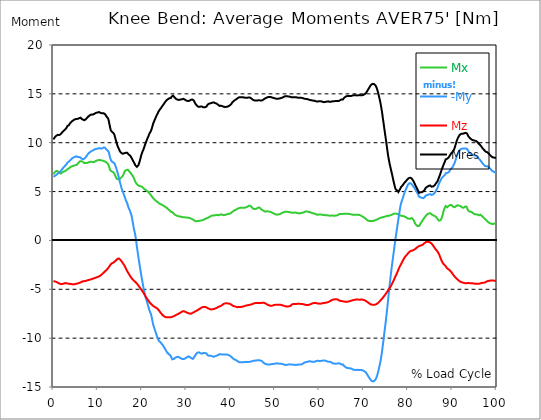
| Category |  Mx |  -My |  Mz |  Mres |
|---|---|---|---|---|
| 0.0 | 6.769 | 6.522 | -4.175 | 10.341 |
| 0.167348456675344 | 6.879 | 6.559 | -4.184 | 10.451 |
| 0.334696913350688 | 6.988 | 6.605 | -4.193 | 10.56 |
| 0.5020453700260321 | 7.061 | 6.65 | -4.211 | 10.642 |
| 0.669393826701376 | 7.107 | 6.705 | -4.248 | 10.716 |
| 0.83674228337672 | 7.107 | 6.769 | -4.294 | 10.77 |
| 1.0040907400520642 | 7.08 | 6.842 | -4.33 | 10.807 |
| 1.1621420602454444 | 7.016 | 6.897 | -4.367 | 10.807 |
| 1.3294905169207885 | 6.934 | 6.934 | -4.403 | 10.789 |
| 1.4968389735961325 | 6.851 | 7.007 | -4.44 | 10.798 |
| 1.6641874302714765 | 6.851 | 7.116 | -4.467 | 10.88 |
| 1.8315358869468206 | 6.915 | 7.198 | -4.476 | 10.971 |
| 1.9988843436221646 | 6.961 | 7.299 | -4.467 | 11.072 |
| 2.1662328002975086 | 7.007 | 7.39 | -4.449 | 11.145 |
| 2.333581256972853 | 7.043 | 7.491 | -4.412 | 11.227 |
| 2.5009297136481967 | 7.08 | 7.582 | -4.403 | 11.3 |
| 2.6682781703235405 | 7.098 | 7.646 | -4.367 | 11.355 |
| 2.8356266269988843 | 7.116 | 7.701 | -4.357 | 11.401 |
| 3.002975083674229 | 7.217 | 7.829 | -4.385 | 11.547 |
| 3.1703235403495724 | 7.317 | 7.966 | -4.403 | 11.711 |
| 3.337671997024917 | 7.336 | 8.03 | -4.421 | 11.775 |
| 3.4957233172182973 | 7.336 | 8.057 | -4.431 | 11.793 |
| 3.663071773893641 | 7.436 | 8.139 | -4.44 | 11.921 |
| 3.8304202305689854 | 7.509 | 8.222 | -4.458 | 12.031 |
| 3.997768687244329 | 7.555 | 8.295 | -4.458 | 12.104 |
| 4.165117143919673 | 7.582 | 8.377 | -4.476 | 12.186 |
| 4.332465600595017 | 7.61 | 8.432 | -4.485 | 12.25 |
| 4.499814057270361 | 7.628 | 8.477 | -4.494 | 12.296 |
| 4.667162513945706 | 7.664 | 8.514 | -4.494 | 12.342 |
| 4.834510970621049 | 7.71 | 8.541 | -4.476 | 12.387 |
| 5.001859427296393 | 7.71 | 8.587 | -4.449 | 12.405 |
| 5.169207883971737 | 7.728 | 8.614 | -4.44 | 12.433 |
| 5.336556340647081 | 7.756 | 8.569 | -4.421 | 12.415 |
| 5.503904797322425 | 7.847 | 8.541 | -4.403 | 12.442 |
| 5.671253253997769 | 7.938 | 8.523 | -4.376 | 12.479 |
| 5.82930457419115 | 8.012 | 8.523 | -4.357 | 12.515 |
| 5.996653030866494 | 8.103 | 8.514 | -4.33 | 12.57 |
| 6.164001487541838 | 8.149 | 8.477 | -4.294 | 12.561 |
| 6.331349944217181 | 8.112 | 8.368 | -4.239 | 12.451 |
| 6.498698400892526 | 8.085 | 8.313 | -4.202 | 12.378 |
| 6.66604685756787 | 8.039 | 8.322 | -4.184 | 12.36 |
| 6.833395314243213 | 7.957 | 8.331 | -4.166 | 12.305 |
| 7.000743770918558 | 7.911 | 8.368 | -4.166 | 12.305 |
| 7.168092227593902 | 7.902 | 8.432 | -4.156 | 12.342 |
| 7.335440684269246 | 7.92 | 8.523 | -4.138 | 12.405 |
| 7.50278914094459 | 7.911 | 8.633 | -4.12 | 12.469 |
| 7.6701375976199335 | 7.938 | 8.761 | -4.083 | 12.579 |
| 7.837486054295278 | 7.966 | 8.852 | -4.056 | 12.643 |
| 7.995537374488658 | 8.002 | 8.943 | -4.047 | 12.725 |
| 8.162885831164003 | 8.039 | 9.016 | -4.029 | 12.807 |
| 8.330234287839346 | 8.048 | 9.062 | -4.001 | 12.844 |
| 8.49758274451469 | 8.039 | 9.108 | -3.983 | 12.862 |
| 8.664931201190035 | 8.039 | 9.163 | -3.956 | 12.89 |
| 8.832279657865378 | 8.021 | 9.199 | -3.928 | 12.908 |
| 8.999628114540721 | 8.002 | 9.226 | -3.901 | 12.899 |
| 9.166976571216066 | 8.021 | 9.263 | -3.882 | 12.935 |
| 9.334325027891412 | 8.057 | 9.318 | -3.846 | 12.981 |
| 9.501673484566755 | 8.103 | 9.354 | -3.809 | 13.027 |
| 9.669021941242098 | 8.158 | 9.382 | -3.791 | 13.072 |
| 9.836370397917442 | 8.185 | 9.4 | -3.764 | 13.1 |
| 10.003718854592787 | 8.194 | 9.391 | -3.736 | 13.091 |
| 10.17106731126813 | 8.222 | 9.418 | -3.709 | 13.109 |
| 10.329118631461512 | 8.24 | 9.455 | -3.672 | 13.136 |
| 10.496467088136853 | 8.231 | 9.464 | -3.618 | 13.118 |
| 10.663815544812199 | 8.203 | 9.409 | -3.581 | 13.045 |
| 10.831164001487544 | 8.194 | 9.391 | -3.535 | 13.018 |
| 10.998512458162887 | 8.185 | 9.418 | -3.453 | 13.008 |
| 11.16586091483823 | 8.176 | 9.446 | -3.398 | 12.999 |
| 11.333209371513574 | 8.13 | 9.51 | -3.307 | 13.008 |
| 11.50055782818892 | 8.085 | 9.546 | -3.206 | 12.981 |
| 11.667906284864264 | 8.075 | 9.482 | -3.161 | 12.926 |
| 11.835254741539607 | 8.012 | 9.373 | -3.088 | 12.798 |
| 12.00260319821495 | 7.966 | 9.272 | -3.015 | 12.67 |
| 12.169951654890292 | 7.911 | 9.236 | -2.942 | 12.606 |
| 12.337300111565641 | 7.82 | 9.19 | -2.85 | 12.497 |
| 12.504648568240984 | 7.637 | 9.035 | -2.741 | 12.25 |
| 12.662699888434362 | 7.399 | 8.733 | -2.631 | 11.857 |
| 12.830048345109708 | 7.18 | 8.432 | -2.521 | 11.474 |
| 12.997396801785053 | 7.089 | 8.203 | -2.421 | 11.227 |
| 13.164745258460396 | 7.071 | 8.085 | -2.348 | 11.127 |
| 13.33209371513574 | 7.034 | 8.048 | -2.311 | 11.072 |
| 13.499442171811083 | 6.988 | 7.993 | -2.284 | 10.999 |
| 13.666790628486426 | 6.906 | 7.984 | -2.229 | 10.926 |
| 13.834139085161771 | 6.76 | 7.838 | -2.165 | 10.706 |
| 14.001487541837117 | 6.586 | 7.628 | -2.101 | 10.423 |
| 14.16883599851246 | 6.413 | 7.427 | -2.028 | 10.158 |
| 14.336184455187803 | 6.294 | 7.18 | -1.955 | 9.893 |
| 14.503532911863147 | 6.23 | 6.906 | -1.873 | 9.647 |
| 14.670881368538492 | 6.248 | 6.641 | -1.845 | 9.473 |
| 14.828932688731873 | 6.294 | 6.34 | -1.854 | 9.318 |
| 14.996281145407215 | 6.294 | 6.011 | -1.928 | 9.135 |
| 15.163629602082558 | 6.358 | 5.709 | -2.01 | 9.035 |
| 15.330978058757903 | 6.44 | 5.417 | -2.101 | 8.952 |
| 15.498326515433247 | 6.513 | 5.18 | -2.211 | 8.888 |
| 15.665674972108594 | 6.596 | 5.015 | -2.32 | 8.87 |
| 15.833023428783937 | 6.769 | 4.796 | -2.43 | 8.907 |
| 16.00037188545928 | 6.97 | 4.568 | -2.549 | 8.925 |
| 16.167720342134626 | 7.107 | 4.367 | -2.704 | 8.962 |
| 16.335068798809967 | 7.189 | 4.129 | -2.85 | 8.962 |
| 16.502417255485312 | 7.217 | 4.047 | -3.015 | 9.007 |
| 16.669765712160658 | 7.235 | 3.8 | -3.152 | 8.962 |
| 16.837114168836 | 7.226 | 3.535 | -3.28 | 8.888 |
| 17.004462625511344 | 7.144 | 3.298 | -3.398 | 8.797 |
| 17.16251394570472 | 7.034 | 3.161 | -3.535 | 8.733 |
| 17.32986240238007 | 6.97 | 2.96 | -3.654 | 8.669 |
| 17.497210859055414 | 6.86 | 2.741 | -3.764 | 8.55 |
| 17.664559315730756 | 6.751 | 2.485 | -3.873 | 8.432 |
| 17.8319077724061 | 6.641 | 2.055 | -3.956 | 8.276 |
| 17.999256229081443 | 6.522 | 1.635 | -4.038 | 8.13 |
| 18.166604685756788 | 6.385 | 1.188 | -4.111 | 7.993 |
| 18.333953142432133 | 6.184 | 0.868 | -4.184 | 7.838 |
| 18.501301599107478 | 5.993 | 0.502 | -4.257 | 7.683 |
| 18.668650055782823 | 5.865 | -0.009 | -4.33 | 7.591 |
| 18.835998512458165 | 5.773 | -0.603 | -4.412 | 7.536 |
| 19.00334696913351 | 5.691 | -1.133 | -4.504 | 7.573 |
| 19.170695425808855 | 5.618 | -1.653 | -4.604 | 7.683 |
| 19.338043882484197 | 5.582 | -2.147 | -4.705 | 7.893 |
| 19.496095202677576 | 5.572 | -2.64 | -4.814 | 8.149 |
| 19.66344365935292 | 5.554 | -3.115 | -4.924 | 8.423 |
| 19.830792116028263 | 5.527 | -3.572 | -5.024 | 8.733 |
| 19.998140572703612 | 5.49 | -4.01 | -5.143 | 8.952 |
| 20.165489029378953 | 5.417 | -4.431 | -5.253 | 9.144 |
| 20.3328374860543 | 5.335 | -4.86 | -5.362 | 9.327 |
| 20.500185942729644 | 5.262 | -5.198 | -5.49 | 9.537 |
| 20.667534399404985 | 5.207 | -5.6 | -5.618 | 9.775 |
| 20.83488285608033 | 5.152 | -5.874 | -5.755 | 9.994 |
| 21.002231312755672 | 5.116 | -6.093 | -5.874 | 10.186 |
| 21.16957976943102 | 5.061 | -6.349 | -5.984 | 10.378 |
| 21.336928226106362 | 4.988 | -6.605 | -6.093 | 10.551 |
| 21.504276682781704 | 4.906 | -6.879 | -6.203 | 10.734 |
| 21.67162513945705 | 4.823 | -7.153 | -6.303 | 10.926 |
| 21.82967645965043 | 4.732 | -7.345 | -6.404 | 11.063 |
| 21.997024916325774 | 4.641 | -7.518 | -6.495 | 11.191 |
| 22.16437337300112 | 4.531 | -7.829 | -6.559 | 11.392 |
| 22.33172182967646 | 4.449 | -8.203 | -6.623 | 11.656 |
| 22.499070286351806 | 4.339 | -8.578 | -6.696 | 11.93 |
| 22.666418743027148 | 4.248 | -8.834 | -6.751 | 12.131 |
| 22.833767199702496 | 4.175 | -9.062 | -6.797 | 12.305 |
| 23.00111565637784 | 4.102 | -9.281 | -6.851 | 12.479 |
| 23.168464113053183 | 4.038 | -9.528 | -6.888 | 12.661 |
| 23.335812569728528 | 3.974 | -9.756 | -6.934 | 12.835 |
| 23.50316102640387 | 3.928 | -9.948 | -6.998 | 12.972 |
| 23.670509483079215 | 3.864 | -10.158 | -7.071 | 13.136 |
| 23.83785793975456 | 3.8 | -10.295 | -7.171 | 13.273 |
| 23.995909259947936 | 3.755 | -10.387 | -7.272 | 13.383 |
| 24.163257716623285 | 3.709 | -10.423 | -7.381 | 13.456 |
| 24.330606173298627 | 3.7 | -10.533 | -7.473 | 13.584 |
| 24.49795462997397 | 3.654 | -10.615 | -7.564 | 13.694 |
| 24.665303086649313 | 3.599 | -10.697 | -7.646 | 13.794 |
| 24.83265154332466 | 3.554 | -10.816 | -7.719 | 13.913 |
| 25.0 | 3.499 | -10.953 | -7.774 | 14.022 |
| 25.167348456675345 | 3.453 | -11.081 | -7.82 | 14.132 |
| 25.334696913350694 | 3.407 | -11.2 | -7.847 | 14.233 |
| 25.502045370026035 | 3.362 | -11.337 | -7.865 | 14.333 |
| 25.669393826701377 | 3.289 | -11.474 | -7.874 | 14.424 |
| 25.836742283376722 | 3.225 | -11.538 | -7.865 | 14.452 |
| 26.004090740052067 | 3.161 | -11.62 | -7.865 | 14.507 |
| 26.17143919672741 | 3.097 | -11.702 | -7.874 | 14.552 |
| 26.329490516920792 | 3.015 | -11.739 | -7.865 | 14.552 |
| 26.49683897359613 | 2.942 | -11.803 | -7.856 | 14.571 |
| 26.66418743027148 | 2.914 | -12.013 | -7.838 | 14.717 |
| 26.831535886946828 | 2.878 | -12.168 | -7.811 | 14.817 |
| 26.998884343622166 | 2.814 | -12.205 | -7.792 | 14.817 |
| 27.166232800297514 | 2.75 | -12.131 | -7.756 | 14.726 |
| 27.333581256972852 | 2.677 | -12.095 | -7.701 | 14.653 |
| 27.5009297136482 | 2.613 | -12.004 | -7.674 | 14.552 |
| 27.668278170323543 | 2.558 | -11.949 | -7.637 | 14.479 |
| 27.835626626998888 | 2.54 | -11.93 | -7.591 | 14.433 |
| 28.002975083674233 | 2.503 | -11.921 | -7.564 | 14.406 |
| 28.170323540349575 | 2.485 | -11.903 | -7.527 | 14.37 |
| 28.33767199702492 | 2.466 | -11.94 | -7.491 | 14.379 |
| 28.50502045370026 | 2.448 | -12.004 | -7.427 | 14.406 |
| 28.663071773893645 | 2.439 | -12.04 | -7.39 | 14.415 |
| 28.830420230568986 | 2.421 | -12.077 | -7.345 | 14.415 |
| 28.99776868724433 | 2.393 | -12.131 | -7.29 | 14.443 |
| 29.165117143919673 | 2.375 | -12.15 | -7.253 | 14.443 |
| 29.33246560059502 | 2.384 | -12.214 | -7.253 | 14.497 |
| 29.499814057270367 | 2.366 | -12.122 | -7.253 | 14.406 |
| 29.66716251394571 | 2.366 | -12.113 | -7.281 | 14.406 |
| 29.834510970621054 | 2.357 | -12.058 | -7.317 | 14.37 |
| 30.00185942729639 | 2.348 | -11.985 | -7.363 | 14.315 |
| 30.169207883971744 | 2.339 | -11.93 | -7.39 | 14.287 |
| 30.33655634064708 | 2.32 | -11.903 | -7.418 | 14.269 |
| 30.50390479732243 | 2.32 | -11.867 | -7.454 | 14.26 |
| 30.671253253997772 | 2.32 | -11.876 | -7.491 | 14.287 |
| 30.829304574191156 | 2.284 | -11.949 | -7.5 | 14.342 |
| 30.996653030866494 | 2.247 | -12.013 | -7.491 | 14.388 |
| 31.164001487541842 | 2.211 | -12.068 | -7.473 | 14.424 |
| 31.331349944217187 | 2.183 | -12.095 | -7.436 | 14.424 |
| 31.498698400892525 | 2.138 | -12.122 | -7.39 | 14.415 |
| 31.666046857567874 | 2.074 | -12.058 | -7.345 | 14.324 |
| 31.833395314243212 | 2.028 | -11.885 | -7.308 | 14.159 |
| 32.00074377091856 | 1.982 | -11.775 | -7.262 | 14.041 |
| 32.1680922275939 | 1.964 | -11.638 | -7.226 | 13.913 |
| 32.33544068426925 | 1.973 | -11.547 | -7.18 | 13.812 |
| 32.50278914094459 | 1.982 | -11.483 | -7.144 | 13.739 |
| 32.670137597619934 | 1.991 | -11.455 | -7.089 | 13.694 |
| 32.83748605429528 | 2.001 | -11.455 | -7.043 | 13.666 |
| 33.004834510970625 | 2.01 | -11.474 | -7.007 | 13.666 |
| 33.162885831164004 | 2.028 | -11.538 | -6.952 | 13.694 |
| 33.33023428783935 | 2.046 | -11.592 | -6.888 | 13.73 |
| 33.497582744514695 | 2.055 | -11.592 | -6.851 | 13.712 |
| 33.664931201190036 | 2.074 | -11.556 | -6.824 | 13.666 |
| 33.83227965786538 | 2.101 | -11.51 | -6.806 | 13.62 |
| 33.99962811454073 | 2.138 | -11.519 | -6.797 | 13.62 |
| 34.16697657121607 | 2.183 | -11.529 | -6.806 | 13.63 |
| 34.33432502789141 | 2.22 | -11.547 | -6.824 | 13.657 |
| 34.50167348456676 | 2.266 | -11.556 | -6.842 | 13.684 |
| 34.6690219412421 | 2.302 | -11.62 | -6.888 | 13.776 |
| 34.83637039791744 | 2.311 | -11.757 | -6.943 | 13.913 |
| 35.00371885459279 | 2.357 | -11.784 | -6.97 | 13.968 |
| 35.17106731126814 | 2.393 | -11.812 | -6.998 | 14.004 |
| 35.338415767943474 | 2.43 | -11.812 | -7.034 | 14.032 |
| 35.49646708813686 | 2.485 | -11.803 | -7.061 | 14.041 |
| 35.6638155448122 | 2.521 | -11.803 | -7.061 | 14.05 |
| 35.831164001487544 | 2.549 | -11.848 | -7.052 | 14.086 |
| 35.998512458162885 | 2.558 | -11.894 | -7.034 | 14.114 |
| 36.165860914838234 | 2.558 | -11.912 | -7.016 | 14.132 |
| 36.333209371513576 | 2.576 | -11.885 | -6.998 | 14.095 |
| 36.50055782818892 | 2.576 | -11.848 | -6.97 | 14.059 |
| 36.667906284864266 | 2.613 | -11.803 | -6.943 | 14.022 |
| 36.83525474153961 | 2.613 | -11.793 | -6.906 | 13.995 |
| 37.002603198214956 | 2.594 | -11.803 | -6.86 | 13.968 |
| 37.1699516548903 | 2.576 | -11.739 | -6.815 | 13.885 |
| 37.337300111565646 | 2.594 | -11.666 | -6.787 | 13.821 |
| 37.50464856824098 | 2.604 | -11.629 | -6.751 | 13.767 |
| 37.66269988843437 | 2.64 | -11.638 | -6.723 | 13.767 |
| 37.83004834510971 | 2.677 | -11.656 | -6.696 | 13.785 |
| 37.99739680178505 | 2.658 | -11.684 | -6.65 | 13.776 |
| 38.16474525846039 | 2.613 | -11.675 | -6.577 | 13.73 |
| 38.33209371513574 | 2.594 | -11.675 | -6.513 | 13.694 |
| 38.49944217181109 | 2.585 | -11.675 | -6.477 | 13.675 |
| 38.666790628486424 | 2.604 | -11.666 | -6.459 | 13.657 |
| 38.83413908516178 | 2.622 | -11.666 | -6.44 | 13.657 |
| 39.001487541837115 | 2.64 | -11.666 | -6.44 | 13.666 |
| 39.16883599851246 | 2.677 | -11.684 | -6.44 | 13.684 |
| 39.336184455187805 | 2.695 | -11.702 | -6.44 | 13.703 |
| 39.503532911863154 | 2.722 | -11.72 | -6.449 | 13.73 |
| 39.670881368538495 | 2.741 | -11.775 | -6.468 | 13.785 |
| 39.83822982521384 | 2.741 | -11.812 | -6.495 | 13.831 |
| 39.996281145407224 | 2.795 | -11.83 | -6.532 | 13.876 |
| 40.163629602082565 | 2.85 | -11.903 | -6.577 | 13.977 |
| 40.33097805875791 | 2.914 | -12.013 | -6.641 | 14.114 |
| 40.498326515433256 | 2.969 | -12.086 | -6.687 | 14.205 |
| 40.6656749721086 | 3.015 | -12.122 | -6.723 | 14.26 |
| 40.83302342878393 | 3.069 | -12.177 | -6.742 | 14.333 |
| 41.00037188545929 | 3.115 | -12.205 | -6.76 | 14.37 |
| 41.16772034213463 | 3.133 | -12.241 | -6.778 | 14.415 |
| 41.33506879880997 | 3.17 | -12.278 | -6.815 | 14.47 |
| 41.50241725548531 | 3.234 | -12.314 | -6.833 | 14.516 |
| 41.66976571216066 | 3.261 | -12.396 | -6.824 | 14.598 |
| 41.837114168836 | 3.298 | -12.442 | -6.815 | 14.634 |
| 42.004462625511344 | 3.325 | -12.46 | -6.806 | 14.653 |
| 42.17181108218669 | 3.334 | -12.469 | -6.806 | 14.662 |
| 42.32986240238007 | 3.334 | -12.469 | -6.797 | 14.662 |
| 42.497210859055414 | 3.334 | -12.469 | -6.797 | 14.662 |
| 42.66455931573076 | 3.343 | -12.469 | -6.778 | 14.662 |
| 42.831907772406105 | 3.353 | -12.479 | -6.76 | 14.653 |
| 42.999256229081446 | 3.362 | -12.451 | -6.742 | 14.625 |
| 43.16660468575679 | 3.353 | -12.451 | -6.714 | 14.625 |
| 43.33395314243214 | 3.371 | -12.451 | -6.678 | 14.607 |
| 43.50130159910748 | 3.389 | -12.433 | -6.66 | 14.589 |
| 43.66865005578282 | 3.407 | -12.433 | -6.641 | 14.598 |
| 43.83599851245817 | 3.471 | -12.433 | -6.632 | 14.607 |
| 44.00334696913351 | 3.535 | -12.433 | -6.614 | 14.625 |
| 44.17069542580886 | 3.554 | -12.424 | -6.605 | 14.625 |
| 44.3380438824842 | 3.554 | -12.424 | -6.596 | 14.616 |
| 44.49609520267758 | 3.526 | -12.424 | -6.568 | 14.598 |
| 44.66344365935292 | 3.435 | -12.387 | -6.55 | 14.534 |
| 44.83079211602827 | 3.353 | -12.36 | -6.522 | 14.461 |
| 44.99814057270361 | 3.27 | -12.332 | -6.495 | 14.397 |
| 45.16548902937895 | 3.225 | -12.314 | -6.459 | 14.36 |
| 45.332837486054295 | 3.225 | -12.305 | -6.431 | 14.333 |
| 45.500185942729644 | 3.225 | -12.296 | -6.413 | 14.315 |
| 45.66753439940499 | 3.225 | -12.296 | -6.404 | 14.315 |
| 45.83488285608033 | 3.243 | -12.287 | -6.395 | 14.306 |
| 46.00223131275568 | 3.307 | -12.268 | -6.404 | 14.315 |
| 46.16957976943102 | 3.353 | -12.268 | -6.395 | 14.333 |
| 46.336928226106366 | 3.389 | -12.268 | -6.404 | 14.351 |
| 46.50427668278171 | 3.371 | -12.278 | -6.404 | 14.351 |
| 46.671625139457056 | 3.298 | -12.278 | -6.404 | 14.324 |
| 46.829676459650436 | 3.206 | -12.278 | -6.395 | 14.287 |
| 46.99702491632577 | 3.142 | -12.342 | -6.376 | 14.315 |
| 47.16437337300112 | 3.106 | -12.405 | -6.376 | 14.351 |
| 47.33172182967646 | 3.06 | -12.479 | -6.367 | 14.397 |
| 47.49907028635181 | 3.015 | -12.543 | -6.376 | 14.443 |
| 47.66641874302716 | 2.987 | -12.606 | -6.404 | 14.507 |
| 47.83376719970249 | 2.951 | -12.634 | -6.449 | 14.534 |
| 48.001115656377834 | 2.969 | -12.661 | -6.495 | 14.58 |
| 48.16846411305319 | 2.987 | -12.68 | -6.541 | 14.625 |
| 48.33581256972853 | 2.987 | -12.707 | -6.577 | 14.662 |
| 48.50316102640387 | 2.969 | -12.716 | -6.614 | 14.68 |
| 48.67050948307921 | 2.969 | -12.707 | -6.66 | 14.689 |
| 48.837857939754564 | 2.942 | -12.689 | -6.669 | 14.68 |
| 49.005206396429905 | 2.923 | -12.68 | -6.687 | 14.68 |
| 49.163257716623285 | 2.887 | -12.67 | -6.687 | 14.662 |
| 49.33060617329863 | 2.841 | -12.652 | -6.678 | 14.625 |
| 49.49795462997397 | 2.804 | -12.643 | -6.66 | 14.607 |
| 49.66530308664932 | 2.759 | -12.634 | -6.632 | 14.58 |
| 49.832651543324666 | 2.731 | -12.643 | -6.605 | 14.571 |
| 50.0 | 2.686 | -12.625 | -6.596 | 14.543 |
| 50.16734845667534 | 2.658 | -12.597 | -6.586 | 14.507 |
| 50.33469691335069 | 2.64 | -12.579 | -6.577 | 14.488 |
| 50.50204537002604 | 2.64 | -12.579 | -6.577 | 14.479 |
| 50.66939382670139 | 2.64 | -12.588 | -6.577 | 14.497 |
| 50.836742283376715 | 2.658 | -12.588 | -6.577 | 14.507 |
| 51.00409074005207 | 2.686 | -12.625 | -6.577 | 14.534 |
| 51.17143919672741 | 2.713 | -12.625 | -6.577 | 14.552 |
| 51.32949051692079 | 2.759 | -12.625 | -6.596 | 14.561 |
| 51.496838973596134 | 2.795 | -12.634 | -6.614 | 14.589 |
| 51.66418743027148 | 2.841 | -12.643 | -6.641 | 14.616 |
| 51.831535886946824 | 2.868 | -12.67 | -6.669 | 14.653 |
| 51.99888434362217 | 2.896 | -12.707 | -6.687 | 14.698 |
| 52.16623280029752 | 2.923 | -12.743 | -6.705 | 14.744 |
| 52.33358125697285 | 2.932 | -12.743 | -6.733 | 14.762 |
| 52.5009297136482 | 2.942 | -12.734 | -6.751 | 14.762 |
| 52.668278170323546 | 2.932 | -12.725 | -6.769 | 14.762 |
| 52.835626626998895 | 2.923 | -12.725 | -6.769 | 14.762 |
| 53.00297508367424 | 2.914 | -12.707 | -6.76 | 14.735 |
| 53.17032354034958 | 2.896 | -12.68 | -6.742 | 14.708 |
| 53.33767199702492 | 2.896 | -12.68 | -6.733 | 14.708 |
| 53.50502045370027 | 2.887 | -12.689 | -6.696 | 14.698 |
| 53.663071773893655 | 2.85 | -12.698 | -6.614 | 14.662 |
| 53.83042023056899 | 2.832 | -12.707 | -6.541 | 14.644 |
| 53.99776868724433 | 2.832 | -12.716 | -6.522 | 14.644 |
| 54.16511714391967 | 2.832 | -12.716 | -6.513 | 14.634 |
| 54.33246560059503 | 2.841 | -12.725 | -6.513 | 14.644 |
| 54.49981405727037 | 2.85 | -12.743 | -6.513 | 14.662 |
| 54.667162513945705 | 2.859 | -12.743 | -6.504 | 14.662 |
| 54.834510970621054 | 2.841 | -12.734 | -6.495 | 14.644 |
| 55.0018594272964 | 2.814 | -12.725 | -6.486 | 14.625 |
| 55.169207883971744 | 2.786 | -12.716 | -6.486 | 14.607 |
| 55.336556340647086 | 2.768 | -12.707 | -6.486 | 14.598 |
| 55.50390479732243 | 2.759 | -12.725 | -6.486 | 14.607 |
| 55.671253253997776 | 2.777 | -12.707 | -6.495 | 14.607 |
| 55.83860171067312 | 2.804 | -12.707 | -6.495 | 14.607 |
| 55.9966530308665 | 2.814 | -12.68 | -6.495 | 14.598 |
| 56.16400148754184 | 2.832 | -12.643 | -6.504 | 14.571 |
| 56.33134994421718 | 2.85 | -12.597 | -6.522 | 14.552 |
| 56.498698400892536 | 2.878 | -12.552 | -6.55 | 14.525 |
| 56.66604685756788 | 2.914 | -12.497 | -6.568 | 14.497 |
| 56.83339531424321 | 2.951 | -12.469 | -6.586 | 14.479 |
| 57.00074377091856 | 2.96 | -12.451 | -6.596 | 14.479 |
| 57.16809222759391 | 2.96 | -12.442 | -6.614 | 14.479 |
| 57.33544068426925 | 2.951 | -12.424 | -6.614 | 14.461 |
| 57.5027891409446 | 2.942 | -12.396 | -6.605 | 14.433 |
| 57.670137597619934 | 2.932 | -12.369 | -6.577 | 14.397 |
| 57.83748605429528 | 2.887 | -12.378 | -6.559 | 14.379 |
| 58.004834510970625 | 2.868 | -12.378 | -6.532 | 14.36 |
| 58.16288583116401 | 2.841 | -12.396 | -6.495 | 14.351 |
| 58.330234287839346 | 2.804 | -12.415 | -6.459 | 14.333 |
| 58.497582744514695 | 2.786 | -12.415 | -6.431 | 14.315 |
| 58.66493120119004 | 2.777 | -12.415 | -6.413 | 14.306 |
| 58.832279657865385 | 2.75 | -12.424 | -6.395 | 14.296 |
| 58.999628114540734 | 2.741 | -12.415 | -6.385 | 14.287 |
| 59.16697657121607 | 2.704 | -12.369 | -6.395 | 14.251 |
| 59.33432502789142 | 2.686 | -12.332 | -6.413 | 14.223 |
| 59.50167348456676 | 2.622 | -12.296 | -6.449 | 14.205 |
| 59.66902194124211 | 2.631 | -12.314 | -6.459 | 14.223 |
| 59.83637039791745 | 2.649 | -12.332 | -6.459 | 14.242 |
| 60.00371885459278 | 2.649 | -12.342 | -6.468 | 14.251 |
| 60.17106731126813 | 2.649 | -12.342 | -6.477 | 14.251 |
| 60.33841576794349 | 2.64 | -12.342 | -6.468 | 14.251 |
| 60.49646708813685 | 2.64 | -12.332 | -6.459 | 14.233 |
| 60.6638155448122 | 2.613 | -12.305 | -6.44 | 14.196 |
| 60.831164001487544 | 2.604 | -12.296 | -6.413 | 14.169 |
| 60.99851245816289 | 2.594 | -12.278 | -6.404 | 14.15 |
| 61.16586091483824 | 2.594 | -12.268 | -6.395 | 14.141 |
| 61.333209371513576 | 2.585 | -12.305 | -6.376 | 14.169 |
| 61.50055782818892 | 2.576 | -12.342 | -6.367 | 14.196 |
| 61.667906284864266 | 2.576 | -12.36 | -6.358 | 14.205 |
| 61.835254741539615 | 2.567 | -12.378 | -6.34 | 14.205 |
| 62.002603198214956 | 2.567 | -12.415 | -6.312 | 14.233 |
| 62.16995165489029 | 2.549 | -12.424 | -6.276 | 14.214 |
| 62.33730011156564 | 2.54 | -12.415 | -6.239 | 14.187 |
| 62.504648568240995 | 2.53 | -12.424 | -6.194 | 14.169 |
| 62.67199702491633 | 2.53 | -12.46 | -6.157 | 14.187 |
| 62.83004834510971 | 2.549 | -12.552 | -6.093 | 14.242 |
| 62.99739680178505 | 2.549 | -12.579 | -6.066 | 14.251 |
| 63.1647452584604 | 2.54 | -12.588 | -6.057 | 14.242 |
| 63.33209371513575 | 2.54 | -12.597 | -6.038 | 14.251 |
| 63.4994421718111 | 2.53 | -12.625 | -6.02 | 14.26 |
| 63.666790628486424 | 2.53 | -12.616 | -6.02 | 14.26 |
| 63.83413908516177 | 2.549 | -12.606 | -6.02 | 14.251 |
| 64.00148754183712 | 2.558 | -12.606 | -6.029 | 14.26 |
| 64.16883599851248 | 2.585 | -12.588 | -6.047 | 14.251 |
| 64.3361844551878 | 2.64 | -12.561 | -6.093 | 14.26 |
| 64.50353291186315 | 2.695 | -12.57 | -6.157 | 14.296 |
| 64.6708813685385 | 2.704 | -12.606 | -6.184 | 14.342 |
| 64.83822982521384 | 2.713 | -12.661 | -6.194 | 14.397 |
| 65.00557828188919 | 2.713 | -12.698 | -6.203 | 14.433 |
| 65.16362960208257 | 2.713 | -12.689 | -6.212 | 14.433 |
| 65.3309780587579 | 2.722 | -12.689 | -6.221 | 14.433 |
| 65.49832651543326 | 2.722 | -12.807 | -6.248 | 14.552 |
| 65.6656749721086 | 2.713 | -12.89 | -6.276 | 14.634 |
| 65.83302342878395 | 2.722 | -12.935 | -6.276 | 14.68 |
| 66.00037188545929 | 2.741 | -12.99 | -6.285 | 14.735 |
| 66.16772034213463 | 2.731 | -13.036 | -6.276 | 14.762 |
| 66.33506879880998 | 2.731 | -13.054 | -6.267 | 14.781 |
| 66.50241725548531 | 2.722 | -13.063 | -6.258 | 14.79 |
| 66.66976571216065 | 2.722 | -13.072 | -6.239 | 14.79 |
| 66.83711416883601 | 2.704 | -13.081 | -6.221 | 14.79 |
| 67.00446262551135 | 2.686 | -13.091 | -6.194 | 14.781 |
| 67.1718110821867 | 2.677 | -13.109 | -6.166 | 14.781 |
| 67.32986240238007 | 2.658 | -13.155 | -6.148 | 14.808 |
| 67.49721085905541 | 2.631 | -13.191 | -6.121 | 14.835 |
| 67.66455931573076 | 2.631 | -13.219 | -6.111 | 14.845 |
| 67.83190777240611 | 2.64 | -13.237 | -6.093 | 14.863 |
| 67.99925622908145 | 2.649 | -13.255 | -6.075 | 14.872 |
| 68.16660468575678 | 2.631 | -13.264 | -6.057 | 14.863 |
| 68.33395314243214 | 2.631 | -13.255 | -6.057 | 14.854 |
| 68.50130159910749 | 2.631 | -13.237 | -6.047 | 14.835 |
| 68.66865005578282 | 2.622 | -13.237 | -6.047 | 14.835 |
| 68.83599851245816 | 2.631 | -13.264 | -6.057 | 14.863 |
| 69.00334696913352 | 2.613 | -13.264 | -6.057 | 14.863 |
| 69.17069542580886 | 2.585 | -13.273 | -6.066 | 14.872 |
| 69.3380438824842 | 2.567 | -13.273 | -6.057 | 14.872 |
| 69.50539233915956 | 2.512 | -13.264 | -6.038 | 14.845 |
| 69.66344365935292 | 2.466 | -13.282 | -6.047 | 14.854 |
| 69.83079211602826 | 2.421 | -13.31 | -6.066 | 14.881 |
| 69.99814057270362 | 2.375 | -13.346 | -6.084 | 14.909 |
| 70.16548902937896 | 2.32 | -13.383 | -6.121 | 14.954 |
| 70.33283748605429 | 2.266 | -13.438 | -6.157 | 15 |
| 70.50018594272964 | 2.211 | -13.502 | -6.194 | 15.064 |
| 70.667534399405 | 2.165 | -13.584 | -6.258 | 15.155 |
| 70.83488285608033 | 2.065 | -13.748 | -6.303 | 15.301 |
| 71.00223131275568 | 2.037 | -13.84 | -6.349 | 15.402 |
| 71.16957976943102 | 2.001 | -13.995 | -6.413 | 15.566 |
| 71.33692822610637 | 1.982 | -14.086 | -6.486 | 15.685 |
| 71.50427668278171 | 1.982 | -14.214 | -6.522 | 15.813 |
| 71.67162513945706 | 1.973 | -14.324 | -6.541 | 15.923 |
| 71.8389735961324 | 1.982 | -14.36 | -6.568 | 15.968 |
| 71.99702491632577 | 1.982 | -14.424 | -6.577 | 16.023 |
| 72.16437337300113 | 1.991 | -14.443 | -6.586 | 16.041 |
| 72.33172182967647 | 2.019 | -14.397 | -6.596 | 16.005 |
| 72.49907028635181 | 2.046 | -14.342 | -6.586 | 15.959 |
| 72.66641874302715 | 2.074 | -14.242 | -6.559 | 15.868 |
| 72.8337671997025 | 2.11 | -14.086 | -6.532 | 15.722 |
| 73.00111565637783 | 2.147 | -13.895 | -6.477 | 15.53 |
| 73.16846411305319 | 2.174 | -13.63 | -6.431 | 15.274 |
| 73.33581256972853 | 2.202 | -13.319 | -6.367 | 14.982 |
| 73.50316102640387 | 2.247 | -13.008 | -6.285 | 14.671 |
| 73.67050948307921 | 2.284 | -12.652 | -6.203 | 14.342 |
| 73.83785793975457 | 2.32 | -12.287 | -6.121 | 13.977 |
| 74.00520639642991 | 2.339 | -11.803 | -6.038 | 13.529 |
| 74.16325771662328 | 2.366 | -11.318 | -5.956 | 13.072 |
| 74.33060617329863 | 2.384 | -10.679 | -5.856 | 12.488 |
| 74.49795462997398 | 2.393 | -10.122 | -5.764 | 11.985 |
| 74.66530308664932 | 2.412 | -9.473 | -5.673 | 11.428 |
| 74.83265154332466 | 2.439 | -8.87 | -5.563 | 10.907 |
| 75.00000000000001 | 2.476 | -8.258 | -5.463 | 10.378 |
| 75.16734845667534 | 2.503 | -7.573 | -5.353 | 9.829 |
| 75.3346969133507 | 2.512 | -6.87 | -5.234 | 9.29 |
| 75.50204537002605 | 2.521 | -6.148 | -5.125 | 8.733 |
| 75.66939382670138 | 2.53 | -5.399 | -5.006 | 8.313 |
| 75.83674228337672 | 2.54 | -4.695 | -4.896 | 7.902 |
| 76.00409074005208 | 2.567 | -4.019 | -4.769 | 7.564 |
| 76.17143919672742 | 2.594 | -3.353 | -4.641 | 7.226 |
| 76.33878765340276 | 2.631 | -2.741 | -4.504 | 6.915 |
| 76.49683897359614 | 2.667 | -2.165 | -4.348 | 6.577 |
| 76.66418743027148 | 2.704 | -1.59 | -4.184 | 6.221 |
| 76.83153588694682 | 2.731 | -1.032 | -4.029 | 5.883 |
| 76.99888434362218 | 2.75 | -0.438 | -3.864 | 5.572 |
| 77.16623280029752 | 2.75 | 0.128 | -3.691 | 5.289 |
| 77.33358125697285 | 2.768 | 0.63 | -3.535 | 5.18 |
| 77.5009297136482 | 2.731 | 1.151 | -3.353 | 5.125 |
| 77.66827817032356 | 2.686 | 1.672 | -3.179 | 5.079 |
| 77.83562662699889 | 2.649 | 2.183 | -2.987 | 4.951 |
| 78.00297508367423 | 2.604 | 2.649 | -2.814 | 5.033 |
| 78.17032354034959 | 2.567 | 3.17 | -2.658 | 5.216 |
| 78.33767199702493 | 2.53 | 3.599 | -2.512 | 5.371 |
| 78.50502045370027 | 2.521 | 3.892 | -2.366 | 5.499 |
| 78.67236891037561 | 2.503 | 4.12 | -2.211 | 5.572 |
| 78.83042023056899 | 2.494 | 4.33 | -2.065 | 5.664 |
| 78.99776868724433 | 2.485 | 4.577 | -1.937 | 5.773 |
| 79.16511714391969 | 2.466 | 4.814 | -1.8 | 5.883 |
| 79.33246560059503 | 2.439 | 5.043 | -1.681 | 5.984 |
| 79.49981405727036 | 2.384 | 5.189 | -1.599 | 6.047 |
| 79.66716251394571 | 2.339 | 5.362 | -1.507 | 6.139 |
| 79.83451097062107 | 2.275 | 5.545 | -1.416 | 6.23 |
| 80.00185942729641 | 2.247 | 5.709 | -1.325 | 6.331 |
| 80.16920788397174 | 2.229 | 5.792 | -1.233 | 6.367 |
| 80.33655634064709 | 2.211 | 5.856 | -1.16 | 6.404 |
| 80.50390479732243 | 2.22 | 5.883 | -1.087 | 6.422 |
| 80.67125325399778 | 2.275 | 5.837 | -1.069 | 6.404 |
| 80.83860171067312 | 2.293 | 5.773 | -1.051 | 6.349 |
| 80.99665303086651 | 2.229 | 5.655 | -1.041 | 6.23 |
| 81.16400148754184 | 2.156 | 5.563 | -1.014 | 6.121 |
| 81.3313499442172 | 2.028 | 5.454 | -0.959 | 5.974 |
| 81.49869840089255 | 1.836 | 5.362 | -0.914 | 5.819 |
| 81.66604685756786 | 1.699 | 5.216 | -0.868 | 5.646 |
| 81.83339531424322 | 1.59 | 5.088 | -0.795 | 5.49 |
| 82.00074377091858 | 1.507 | 4.97 | -0.731 | 5.353 |
| 82.16809222759392 | 1.462 | 4.823 | -0.676 | 5.198 |
| 82.33544068426926 | 1.443 | 4.668 | -0.621 | 5.033 |
| 82.50278914094459 | 1.48 | 4.476 | -0.566 | 4.869 |
| 82.67013759761994 | 1.59 | 4.394 | -0.548 | 4.832 |
| 82.83748605429528 | 1.745 | 4.412 | -0.539 | 4.924 |
| 83.00483451097062 | 1.845 | 4.394 | -0.502 | 4.96 |
| 83.17218296764597 | 1.955 | 4.348 | -0.457 | 4.951 |
| 83.33023428783935 | 2.083 | 4.303 | -0.429 | 4.96 |
| 83.4975827445147 | 2.192 | 4.33 | -0.393 | 5.033 |
| 83.66493120119004 | 2.302 | 4.33 | -0.301 | 5.07 |
| 83.83227965786537 | 2.393 | 4.476 | -0.238 | 5.225 |
| 83.99962811454073 | 2.494 | 4.604 | -0.174 | 5.381 |
| 84.16697657121607 | 2.594 | 4.595 | -0.128 | 5.426 |
| 84.33432502789142 | 2.667 | 4.632 | -0.128 | 5.49 |
| 84.50167348456677 | 2.722 | 4.668 | -0.137 | 5.554 |
| 84.6690219412421 | 2.759 | 4.695 | -0.155 | 5.582 |
| 84.83637039791745 | 2.777 | 4.723 | -0.183 | 5.618 |
| 85.0037188545928 | 2.786 | 4.741 | -0.21 | 5.627 |
| 85.17106731126813 | 2.741 | 4.686 | -0.247 | 5.563 |
| 85.33841576794349 | 2.667 | 4.65 | -0.32 | 5.499 |
| 85.50576422461883 | 2.613 | 4.677 | -0.42 | 5.508 |
| 85.66381554481221 | 2.576 | 4.714 | -0.521 | 5.527 |
| 85.83116400148755 | 2.512 | 4.741 | -0.639 | 5.536 |
| 85.99851245816289 | 2.503 | 4.842 | -0.749 | 5.627 |
| 86.16586091483823 | 2.494 | 4.97 | -0.85 | 5.746 |
| 86.33320937151358 | 2.412 | 5.116 | -0.959 | 5.856 |
| 86.50055782818893 | 2.302 | 5.216 | -1.06 | 5.929 |
| 86.66790628486427 | 2.183 | 5.381 | -1.133 | 6.047 |
| 86.83525474153961 | 2.092 | 5.618 | -1.233 | 6.258 |
| 87.00260319821496 | 2.028 | 5.801 | -1.398 | 6.44 |
| 87.16995165489031 | 2.028 | 5.974 | -1.59 | 6.65 |
| 87.33730011156564 | 2.065 | 6.139 | -1.79 | 6.87 |
| 87.504648568241 | 2.183 | 6.285 | -1.973 | 7.098 |
| 87.67199702491634 | 2.393 | 6.404 | -2.156 | 7.317 |
| 87.83004834510972 | 2.622 | 6.477 | -2.311 | 7.509 |
| 87.99739680178506 | 2.951 | 6.559 | -2.412 | 7.728 |
| 88.1647452584604 | 3.197 | 6.623 | -2.476 | 7.893 |
| 88.33209371513574 | 3.38 | 6.705 | -2.549 | 8.075 |
| 88.49944217181108 | 3.517 | 6.87 | -2.631 | 8.295 |
| 88.66679062848644 | 3.471 | 6.943 | -2.75 | 8.377 |
| 88.83413908516178 | 3.389 | 6.915 | -2.859 | 8.359 |
| 89.00148754183712 | 3.49 | 6.888 | -2.914 | 8.386 |
| 89.16883599851246 | 3.526 | 6.979 | -2.96 | 8.487 |
| 89.33618445518782 | 3.563 | 7.071 | -3.024 | 8.587 |
| 89.50353291186315 | 3.618 | 7.189 | -3.097 | 8.724 |
| 89.6708813685385 | 3.636 | 7.308 | -3.179 | 8.861 |
| 89.83822982521386 | 3.618 | 7.39 | -3.27 | 8.952 |
| 90.00557828188919 | 3.535 | 7.463 | -3.38 | 9.016 |
| 90.16362960208257 | 3.453 | 7.591 | -3.48 | 9.117 |
| 90.3309780587579 | 3.353 | 7.747 | -3.59 | 9.245 |
| 90.49832651543326 | 3.398 | 7.911 | -3.691 | 9.437 |
| 90.66567497210859 | 3.471 | 8.13 | -3.773 | 9.683 |
| 90.83302342878395 | 3.499 | 8.368 | -3.864 | 9.921 |
| 91.00037188545929 | 3.572 | 8.624 | -3.928 | 10.195 |
| 91.16772034213463 | 3.599 | 8.806 | -3.992 | 10.387 |
| 91.33506879880998 | 3.59 | 8.962 | -4.056 | 10.542 |
| 91.50241725548533 | 3.563 | 9.108 | -4.12 | 10.679 |
| 91.66976571216065 | 3.535 | 9.245 | -4.184 | 10.807 |
| 91.83711416883601 | 3.517 | 9.336 | -4.239 | 10.889 |
| 92.00446262551137 | 3.444 | 9.364 | -4.266 | 10.907 |
| 92.1718110821867 | 3.38 | 9.391 | -4.294 | 10.926 |
| 92.33915953886203 | 3.298 | 9.4 | -4.312 | 10.916 |
| 92.49721085905541 | 3.343 | 9.4 | -4.339 | 10.935 |
| 92.66455931573077 | 3.398 | 9.4 | -4.357 | 10.962 |
| 92.83190777240611 | 3.444 | 9.409 | -4.376 | 10.99 |
| 92.99925622908145 | 3.471 | 9.409 | -4.385 | 11.008 |
| 93.1666046857568 | 3.471 | 9.391 | -4.394 | 10.999 |
| 93.33395314243214 | 3.371 | 9.373 | -4.367 | 10.944 |
| 93.50130159910749 | 3.152 | 9.217 | -4.357 | 10.761 |
| 93.66865005578283 | 3.015 | 9.117 | -4.357 | 10.633 |
| 93.83599851245818 | 2.951 | 9.016 | -4.367 | 10.542 |
| 94.00334696913353 | 2.951 | 8.925 | -4.376 | 10.46 |
| 94.17069542580886 | 2.951 | 8.834 | -4.376 | 10.396 |
| 94.3380438824842 | 2.914 | 8.779 | -4.394 | 10.332 |
| 94.50539233915954 | 2.859 | 8.742 | -4.394 | 10.286 |
| 94.66344365935292 | 2.795 | 8.724 | -4.394 | 10.25 |
| 94.83079211602828 | 2.722 | 8.724 | -4.403 | 10.222 |
| 94.99814057270362 | 2.686 | 8.724 | -4.421 | 10.222 |
| 95.16548902937897 | 2.695 | 8.724 | -4.431 | 10.231 |
| 95.33283748605432 | 2.667 | 8.66 | -4.44 | 10.177 |
| 95.50018594272963 | 2.667 | 8.614 | -4.44 | 10.131 |
| 95.66753439940499 | 2.658 | 8.56 | -4.431 | 10.076 |
| 95.83488285608034 | 2.585 | 8.441 | -4.449 | 9.966 |
| 96.00223131275567 | 2.567 | 8.35 | -4.431 | 9.875 |
| 96.16957976943102 | 2.594 | 8.286 | -4.412 | 9.82 |
| 96.33692822610638 | 2.631 | 8.249 | -4.394 | 9.802 |
| 96.50427668278171 | 2.567 | 8.103 | -4.367 | 9.647 |
| 96.67162513945706 | 2.503 | 7.984 | -4.348 | 9.537 |
| 96.8389735961324 | 2.439 | 7.884 | -4.33 | 9.427 |
| 96.99702491632577 | 2.357 | 7.792 | -4.33 | 9.345 |
| 97.16437337300111 | 2.293 | 7.71 | -4.339 | 9.263 |
| 97.33172182967647 | 2.22 | 7.628 | -4.312 | 9.172 |
| 97.49907028635181 | 2.138 | 7.582 | -4.266 | 9.089 |
| 97.66641874302715 | 2.065 | 7.582 | -4.22 | 9.053 |
| 97.8337671997025 | 1.982 | 7.6 | -4.175 | 9.035 |
| 98.00111565637785 | 1.909 | 7.582 | -4.156 | 8.989 |
| 98.16846411305319 | 1.864 | 7.518 | -4.147 | 8.916 |
| 98.33581256972855 | 1.8 | 7.427 | -4.129 | 8.825 |
| 98.50316102640389 | 1.772 | 7.354 | -4.111 | 8.742 |
| 98.67050948307921 | 1.736 | 7.29 | -4.102 | 8.678 |
| 98.83785793975456 | 1.699 | 7.18 | -4.093 | 8.587 |
| 99.0052063964299 | 1.681 | 7.125 | -4.093 | 8.541 |
| 99.17255485310525 | 1.672 | 7.071 | -4.102 | 8.496 |
| 99.33060617329863 | 1.699 | 7.016 | -4.111 | 8.468 |
| 99.49795462997399 | 1.727 | 6.998 | -4.129 | 8.468 |
| 99.66530308664933 | 1.754 | 6.979 | -4.138 | 8.468 |
| 99.83265154332467 | 1.745 | 6.924 | -4.138 | 8.432 |
| 100.0 | 1.754 | 6.906 | -4.147 | 8.432 |